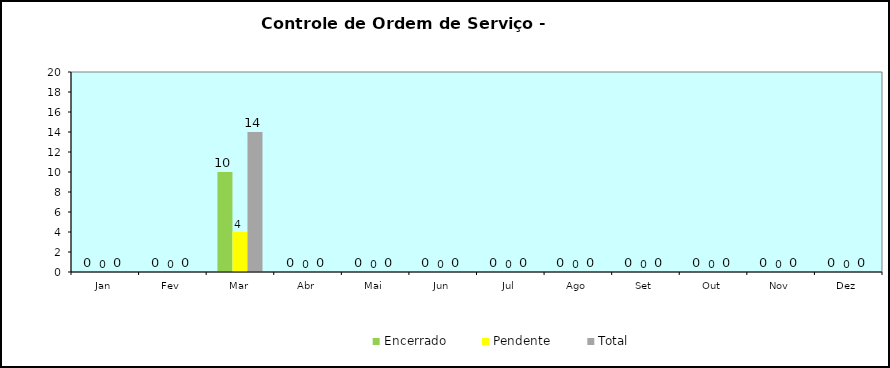
| Category | Encerrado | Pendente | Total |
|---|---|---|---|
| Jan | 0 | 0 | 0 |
| Fev | 0 | 0 | 0 |
| Mar | 10 | 4 | 14 |
| Abr | 0 | 0 | 0 |
| Mai | 0 | 0 | 0 |
| Jun | 0 | 0 | 0 |
| Jul | 0 | 0 | 0 |
| Ago | 0 | 0 | 0 |
| Set | 0 | 0 | 0 |
| Out | 0 | 0 | 0 |
| Nov | 0 | 0 | 0 |
| Dez | 0 | 0 | 0 |